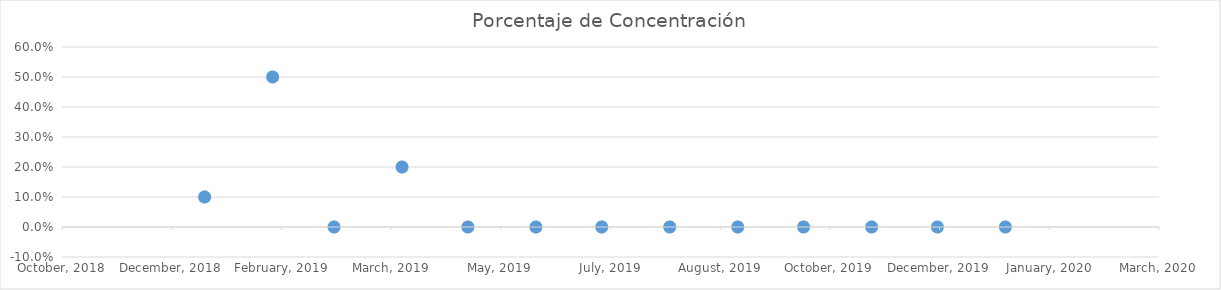
| Category | Porcentaje de Concentración |
|---|---|
| 43465.0 | 0.1 |
| 43496.0 | 0.5 |
| 43524.0 | 0 |
| 43555.0 | 0.2 |
| 43585.0 | 0 |
| 43616.0 | 0 |
| 43646.0 | 0 |
| 43677.0 | 0 |
| 43708.0 | 0 |
| 43738.0 | 0 |
| 43769.0 | 0 |
| 43799.0 | 0 |
| 43830.0 | 0 |